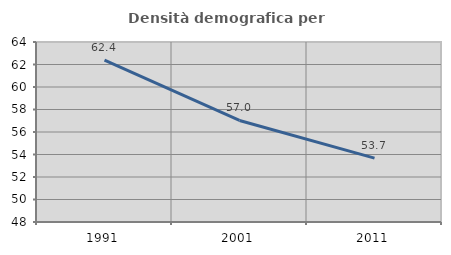
| Category | Densità demografica |
|---|---|
| 1991.0 | 62.384 |
| 2001.0 | 57.028 |
| 2011.0 | 53.68 |